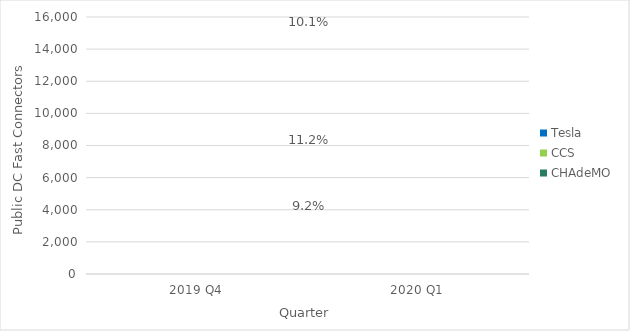
| Category | CHAdeMO | CCS | Tesla |
|---|---|---|---|
| 2019 Q4 | 0 | 0 | 0 |
| 2020 Q1 | 0 | 0 | 0 |